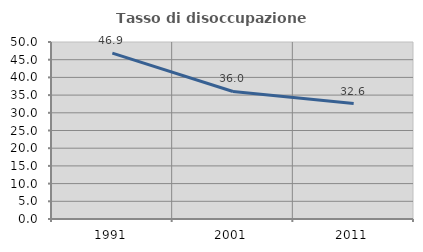
| Category | Tasso di disoccupazione giovanile  |
|---|---|
| 1991.0 | 46.851 |
| 2001.0 | 36.028 |
| 2011.0 | 32.624 |